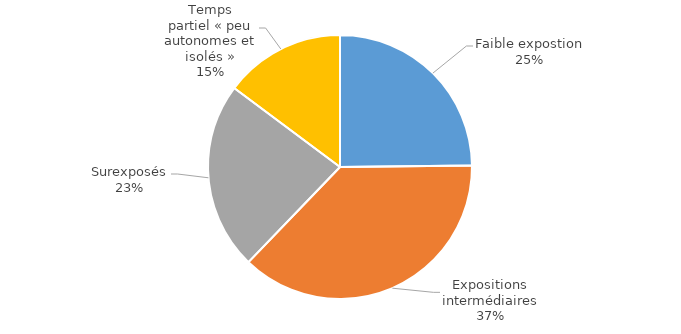
| Category | Series 0 |
|---|---|
| Faible expostion | 0.248 |
| Expositions intermédiaires | 0.374 |
| Surexposés | 0.23 |
| Temps partiel « peu autonomes et isolés » | 0.148 |